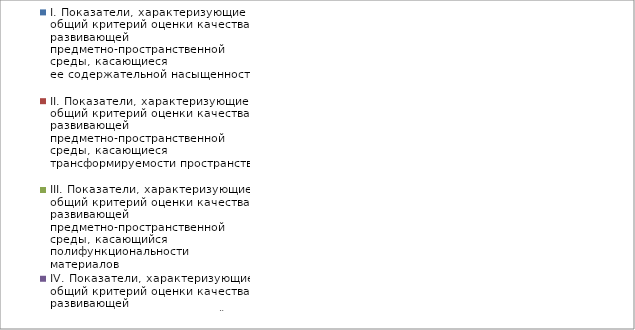
| Category | I. Показатели, характеризующие общий критерий оценки качества развивающей предметно-пространственной среды, касающиеся ее содержательной насыщенности | II. Показатели, характеризующие общий критерий оценки качества развивающей предметно-пространственной среды, касающиеся трансформируемости пространства | III. Показатели, характеризующие общий критерий оценки качества развивающей предметно-пространственной среды, касающийся полифункциональности материалов | IV. Показатели, характеризующие общий критерий оценки качества развивающей предметно-пространственной среды, касающиеся ее вариативности | V. Показатели, характеризующие общий критерий оценки качества развивающей предметно-пространственной среды, касающиеся ее доступности | VI. Показатели, характеризующие общий критерий оценки качества развивающей предметно-пространственной среды, касающиеся безопасности предметно-пространственной среды |
|---|---|---|---|---|---|---|
| Лучики | 0.955 | 0.75 | 0.694 | 1 | 0.875 | 0.825 |